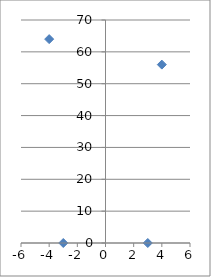
| Category | Series 0 |
|---|---|
| -3.0 | 0 |
| 3.0 | 0 |
| -4.0 | 64 |
| 4.0 | 56 |